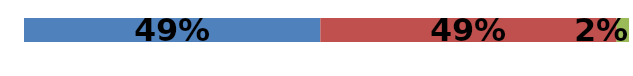
| Category | Series 0 | Series 1 | Series 2 |
|---|---|---|---|
| 0 | 0.49 | 0.49 | 0.02 |